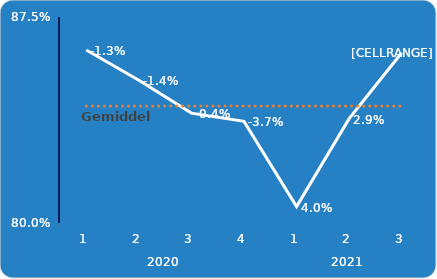
| Category | Som van Tevredenheid met het leven | Som van Gemiddelde |
|---|---|---|
| 0 | 0.863 | 0.843 |
| 1 | 0.852 | 0.843 |
| 2 | 0.84 | 0.843 |
| 3 | 0.837 | 0.843 |
| 4 | 0.806 | 0.843 |
| 5 | 0.838 | 0.843 |
| 6 | 0.862 | 0.843 |